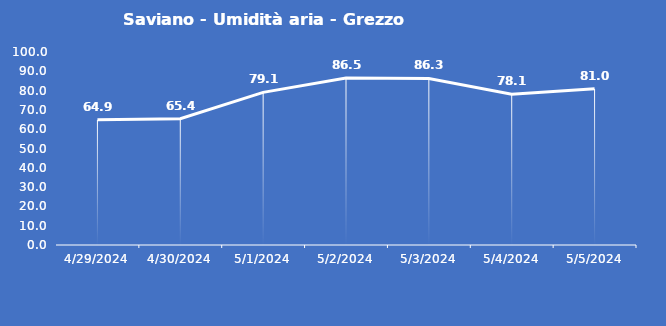
| Category | Saviano - Umidità aria - Grezzo (%) |
|---|---|
| 4/29/24 | 64.9 |
| 4/30/24 | 65.4 |
| 5/1/24 | 79.1 |
| 5/2/24 | 86.5 |
| 5/3/24 | 86.3 |
| 5/4/24 | 78.1 |
| 5/5/24 | 81 |